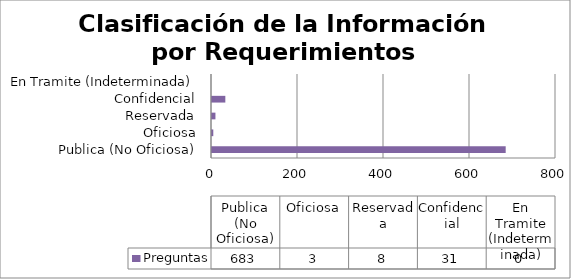
| Category | Preguntas |
|---|---|
| Publica (No Oficiosa) | 683 |
| Oficiosa | 3 |
| Reservada | 8 |
| Confidencial | 31 |
| En Tramite (Indeterminada) | 0 |